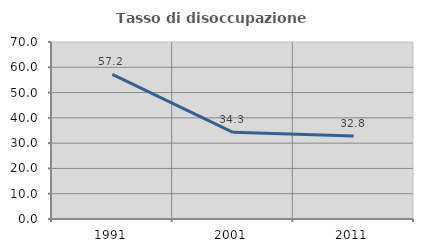
| Category | Tasso di disoccupazione giovanile  |
|---|---|
| 1991.0 | 57.205 |
| 2001.0 | 34.266 |
| 2011.0 | 32.787 |